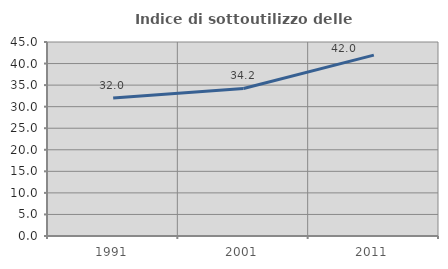
| Category | Indice di sottoutilizzo delle abitazioni  |
|---|---|
| 1991.0 | 32.011 |
| 2001.0 | 34.216 |
| 2011.0 | 41.956 |